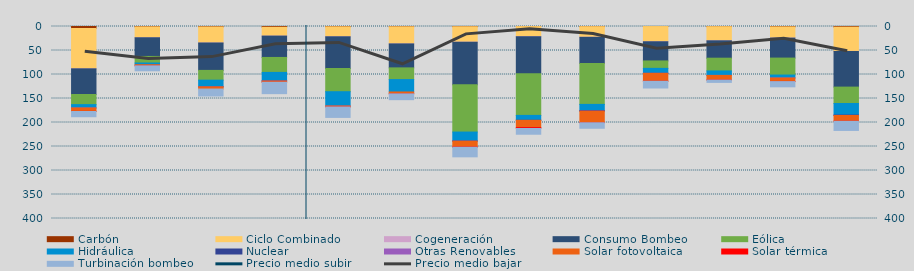
| Category | Carbón | Ciclo Combinado | Cogeneración | Consumo Bombeo | Eólica | Hidráulica | Nuclear | Otras Renovables | Solar fotovoltaica | Solar térmica | Turbinación bombeo |
|---|---|---|---|---|---|---|---|---|---|---|---|
| S | 4138.5 | 84055.788 | 26 | 53462.35 | 21071.172 | 6988.753 | 0 | 0.85 | 7069.199 | 219.625 | 10948.251 |
| O | 766.425 | 22723.1 | 23.25 | 38873.508 | 13638.3 | 3548.975 | 0 | 0 | 2254.075 | 15.75 | 10421.953 |
| N | 882.249 | 33437.299 | 73.35 | 57054.7 | 20324.708 | 13802.882 | 172 | 5.375 | 4519.267 | 0 | 14514.075 |
| D | 1625.533 | 18353.308 | 50.675 | 44452.158 | 31169.809 | 17718.259 | 225.525 | 7.75 | 2457.35 | 4.225 | 23848.4 |
| E | 624.15 | 20714.774 | 137.817 | 66005.482 | 48358.133 | 29783.675 | 0 | 1 | 1942.858 | 28.625 | 21792.308 |
| F | 573.3 | 35710.625 | 48.25 | 49890.275 | 24355.325 | 25831 | 0 | 0 | 3780.125 | 69.225 | 12196.8 |
| M | 501.25 | 32124.392 | 164.517 | 88685.498 | 98417.968 | 18612.512 | 448.75 | 16.575 | 11880.15 | 572.625 | 20112.843 |
| A | 170 | 20766.184 | 571.725 | 76937.455 | 86761.121 | 10133.333 | 40.925 | 0 | 14988.025 | 2004.65 | 12082.525 |
| M | 320.375 | 21993.7 | 252.925 | 54297.65 | 85403.658 | 12766.317 | 1357.65 | 14.475 | 23573.033 | 453.85 | 11577.425 |
| J | 92.075 | 31710.184 | 28.017 | 39954.501 | 15416.333 | 10344.86 | 11.25 | 38.75 | 16255.675 | 192.1 | 14074.425 |
| J | 322.925 | 29487.87 | 56.5 | 36148.45 | 26555.431 | 9322.947 | 0 | 27.5 | 9428.357 | 218.775 | 4884.775 |
| A | 791.025 | 23383.803 | 61.5 | 41567.115 | 35359.804 | 6042.439 | 0 | 145.075 | 7086.59 | 334.925 | 10897.775 |
| S | 1345.508 | 50563.018 | 49 | 74303.001 | 34150.357 | 24005.525 | 791.75 | 160.275 | 11766.108 | 299.95 | 19108.925 |